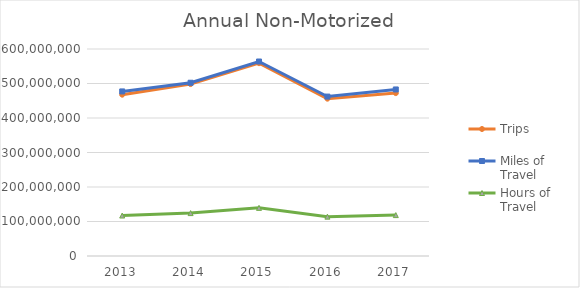
| Category | Trips | Miles of Travel | Hours of Travel |
|---|---|---|---|
| 2013 | 467562114.042 | 477013334.841 | 117273430.035 |
| 2014 | 498325459.14 | 502175313.967 | 124356296 |
| 2015 | 558937096.455 | 563758207.296 | 139533005.985 |
| 2016 | 456012526.897 | 462088640.744 | 114056936.882 |
| 2017 | 472163623.17 | 482714742.992 | 118530018.359 |